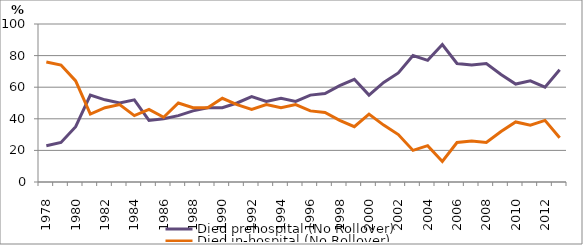
| Category | Died prehospital (No Rollover) | Died in-hospital (No Rollover) |
|---|---|---|
| 1978.0 | 23 | 76 |
| 1979.0 | 25 | 74 |
| 1980.0 | 35 | 64 |
| 1981.0 | 55 | 43 |
| 1982.0 | 52 | 47 |
| 1983.0 | 50 | 49 |
| 1984.0 | 52 | 42 |
| 1985.0 | 39 | 46 |
| 1986.0 | 40 | 41 |
| 1987.0 | 42 | 50 |
| 1988.0 | 45 | 47 |
| 1989.0 | 47 | 47 |
| 1990.0 | 47 | 53 |
| 1991.0 | 50 | 49 |
| 1992.0 | 54 | 46 |
| 1993.0 | 51 | 49 |
| 1994.0 | 53 | 47 |
| 1995.0 | 51 | 49 |
| 1996.0 | 55 | 45 |
| 1997.0 | 56 | 44 |
| 1998.0 | 61 | 39 |
| 1999.0 | 65 | 35 |
| 2000.0 | 55 | 43 |
| 2001.0 | 63 | 36 |
| 2002.0 | 69 | 30 |
| 2003.0 | 80 | 20 |
| 2004.0 | 77 | 23 |
| 2005.0 | 87 | 13 |
| 2006.0 | 75 | 25 |
| 2007.0 | 74 | 26 |
| 2008.0 | 75 | 25 |
| 2009.0 | 68 | 32 |
| 2010.0 | 62 | 38 |
| 2011.0 | 64 | 36 |
| 2012.0 | 60 | 39 |
| 2013.0 | 71 | 28 |